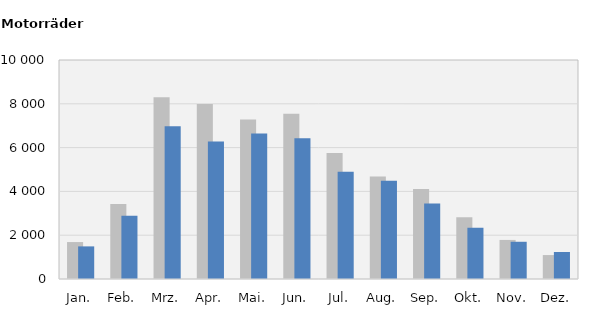
| Category | 2021 | 2022 |
|---|---|---|
| Jan. | 1687 | 1489 |
| Feb. | 3421 | 2884 |
| Mrz. | 8299 | 6971 |
| Apr. | 7990 | 6275 |
| Mai. | 7284 | 6642 |
| Jun. | 7541 | 6425 |
| Jul. | 5759 | 4902 |
| Aug. | 4683 | 4492 |
| Sep. | 4110 | 3448 |
| Okt. | 2817 | 2337 |
| Nov. | 1784 | 1700 |
| Dez. | 1093 | 1234 |